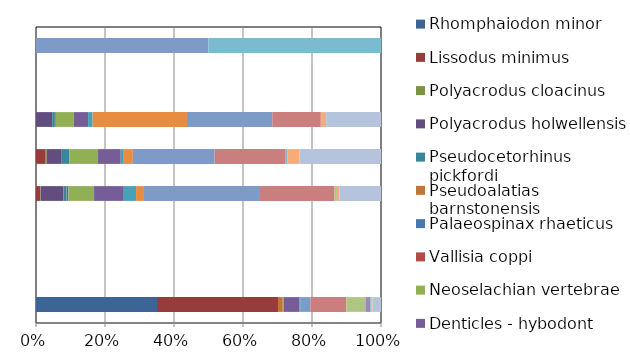
| Category | Rhomphaiodon minor | Lissodus minimus | Polyacrodus cloacinus | Polyacrodus holwellensis | Pseudocetorhinus pickfordi | Pseudoalatias barnstonensis | Palaeospinax rhaeticus | Vallisia coppi | Neoselachian vertebrae | Denticles - hybodont | Denticles - chimaeriform | Denticles - placoid | Gyrolepis alberti | Birgeria acuminata | Saurichthys longidens | Sargodon tomicus | Lepidotes sp. | Fin spines | Fin ray elements |
|---|---|---|---|---|---|---|---|---|---|---|---|---|---|---|---|---|---|---|---|
| 1.0 | 0.334 | 0.334 | 0 | 0 | 0 | 0.013 | 0 | 0 | 0.003 | 0.043 | 0.003 | 0 | 0.026 | 0.099 | 0.053 | 0.013 | 0.003 | 0.003 | 0.023 |
| 2.0 | 0 | 0 | 0 | 0 | 0 | 0 | 0 | 0 | 0 | 0 | 0 | 0 | 0 | 0 | 0 | 0 | 0 | 0 | 0 |
| 3.0 | 0 | 0 | 0 | 0 | 0 | 0 | 0 | 0 | 0 | 0 | 0 | 0 | 0 | 0 | 0 | 0 | 0 | 0 | 0 |
| 4.0 | 0 | 0.01 | 0.001 | 0.051 | 0.006 | 0.001 | 0.005 | 0 | 0.058 | 0.067 | 0.028 | 0.018 | 0.261 | 0.171 | 0.005 | 0 | 0 | 0.005 | 0.095 |
| 5.0 | 0 | 0.023 | 0.004 | 0.038 | 0.019 | 0 | 0 | 0 | 0.071 | 0.056 | 0.008 | 0.023 | 0.203 | 0.177 | 0 | 0 | 0.004 | 0.03 | 0.203 |
| 7.0 | 0 | 0 | 0 | 0.031 | 0.005 | 0 | 0 | 0.002 | 0.035 | 0.028 | 0.009 | 0.183 | 0.166 | 0.094 | 0 | 0 | 0 | 0.01 | 0.106 |
| 8.0 | 0 | 0 | 0 | 0 | 0 | 0 | 0 | 0 | 0 | 0 | 0 | 0 | 0 | 0 | 0 | 0 | 0 | 0 | 0 |
| 9.0 | 0 | 0 | 0 | 0 | 0 | 0 | 0 | 0 | 0 | 0 | 0 | 0 | 0.5 | 0 | 0 | 0 | 0.5 | 0 | 0 |